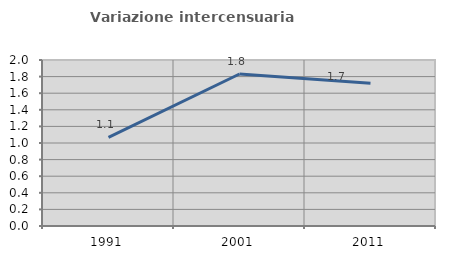
| Category | Variazione intercensuaria annua |
|---|---|
| 1991.0 | 1.067 |
| 2001.0 | 1.832 |
| 2011.0 | 1.719 |